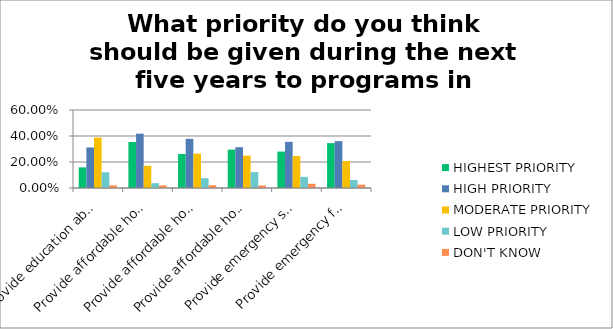
| Category | HIGHEST PRIORITY | HIGH PRIORITY | MODERATE PRIORITY | LOW PRIORITY | DON'T KNOW |
|---|---|---|---|---|---|
| Provide education about healthy lifestyles for all ages (physical activity, smoking, nutrition)? | 0.159 | 0.312 | 0.388 | 0.121 | 0.02 |
| Provide affordable housing for the elderly? | 0.354 | 0.418 | 0.171 | 0.037 | 0.02 |
| Provide affordable housing for moderate income households? | 0.261 | 0.378 | 0.264 | 0.075 | 0.021 |
| Provide affordable housing for low income households? | 0.295 | 0.314 | 0.249 | 0.122 | 0.02 |
| Provide emergency shelter? | 0.28 | 0.355 | 0.247 | 0.086 | 0.032 |
| Provide emergency food? | 0.345 | 0.361 | 0.208 | 0.061 | 0.026 |